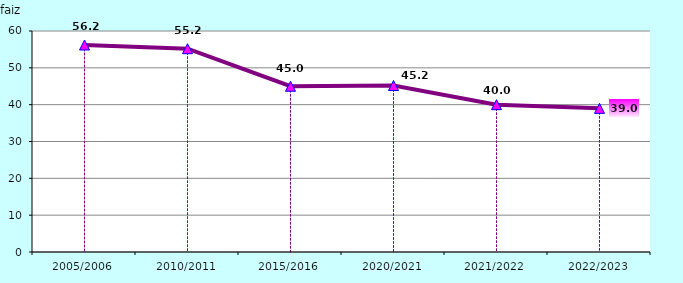
| Category | Series 1 | Series 2 |
|---|---|---|
| 2005/2006 | 56.2 |  |
| 2010/2011 | 55.2 |  |
| 2015/2016 | 45 |  |
| 2020/2021 | 45.2 |  |
| 2021/2022 | 40 |  |
| 2022/2023 | 39 |  |